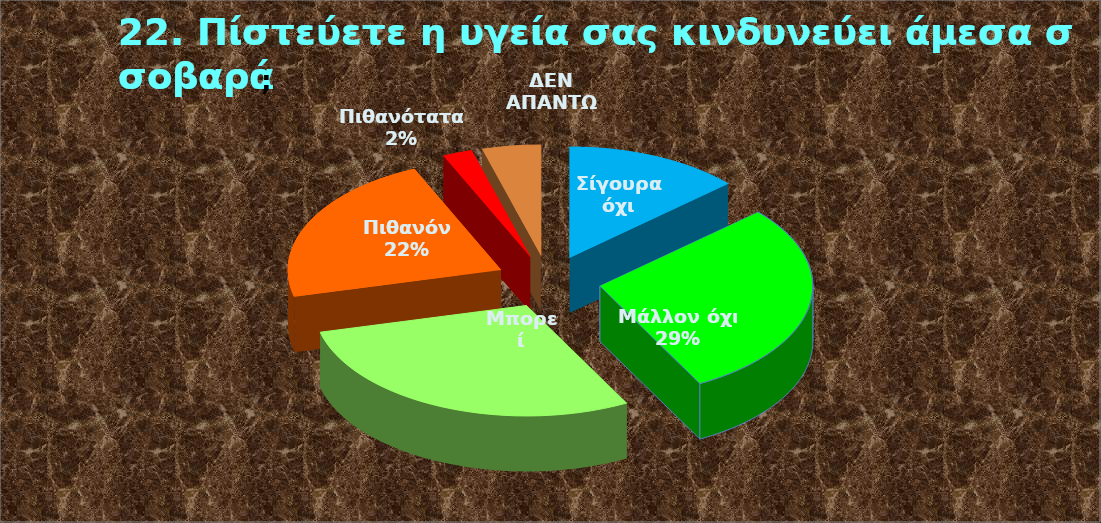
| Category | Series 0 |
|---|---|
| Σίγουρα όχι | 0.133 |
| Μάλλον όχι  | 0.289 |
| Μπορεί | 0.289 |
| Πιθανόν  | 0.222 |
| Πιθανότατα  | 0.022 |
| ΔΕΝ ΑΠΑΝΤΩ | 0.044 |